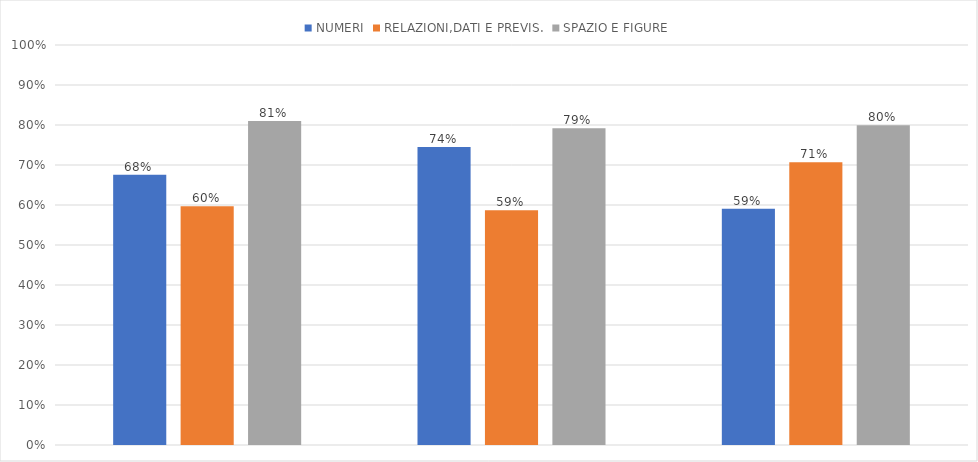
| Category | NUMERI | RELAZIONI,DATI E PREVIS. | SPAZIO E FIGURE |
|---|---|---|---|
| 1A Vivaldi | 0.676 | 0.597 | 0.81 |
| 1B Vivaldi | 0.745 | 0.587 | 0.792 |
| 1C Vivaldi | 0.591 | 0.707 | 0.799 |